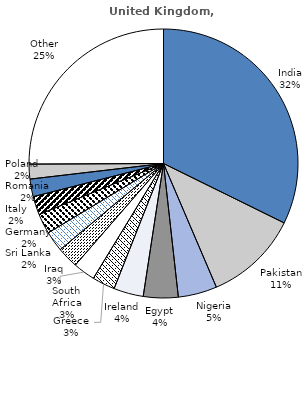
| Category | United Kingdom, 2017 |
|---|---|
| India | 16571 |
| Pakistan | 5792 |
| Nigeria | 2396 |
| Egypt | 2144 |
| Ireland | 1833 |
| Greece | 1409 |
| South Africa | 1359 |
| Iraq | 1313 |
| Sri Lanka | 1255 |
| Germany | 1245 |
| Italy | 1141 |
| Romania | 1087 |
| Poland | 914 |
| Other | 12870 |